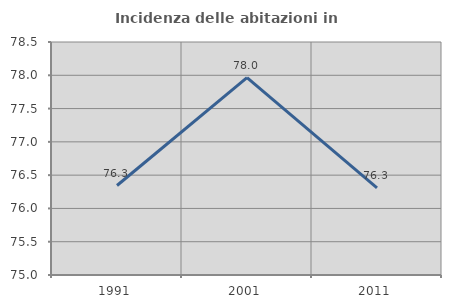
| Category | Incidenza delle abitazioni in proprietà  |
|---|---|
| 1991.0 | 76.344 |
| 2001.0 | 77.966 |
| 2011.0 | 76.307 |